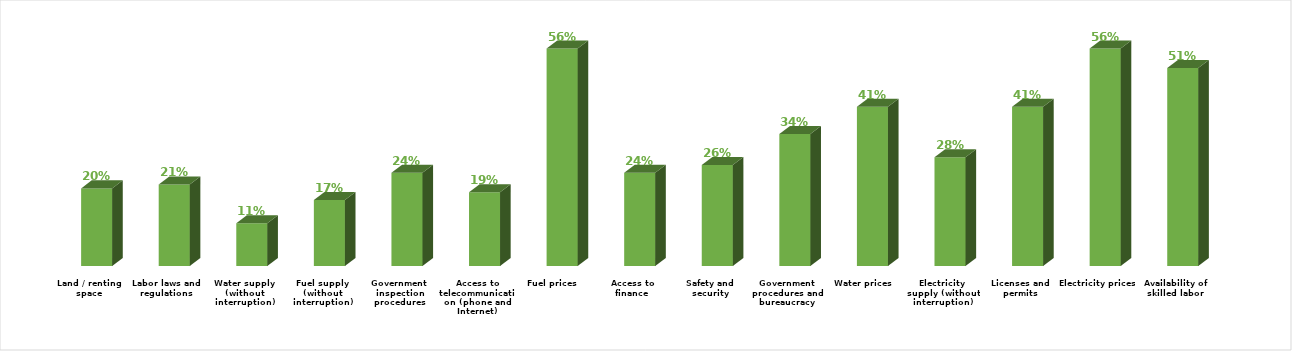
| Category | Series 0 |
|---|---|
| Availability of skilled labor | 0.51 |
| Electricity prices | 0.56 |
| Licenses and permits | 0.41 |
| Electricity supply (without interruption) | 0.28 |
| Water prices | 0.41 |
| Government procedures and bureaucracy | 0.34 |
| Safety and security | 0.26 |
| Access to finance | 0.24 |
| Fuel prices | 0.56 |
| Access to telecommunication (phone and Internet) | 0.19 |
| Government inspection procedures | 0.24 |
| Fuel supply (without interruption) | 0.17 |
| Water supply (without interruption) | 0.11 |
| Labor laws and regulations | 0.21 |
| Land / renting space | 0.2 |